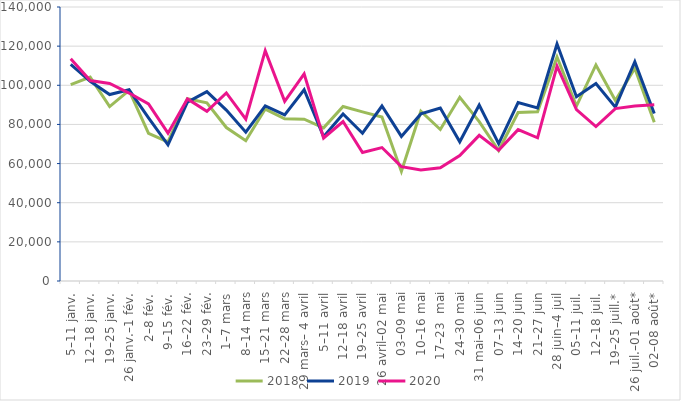
| Category | 2018 | 2019 | 2020 |
|---|---|---|---|
| 5–11 janv. | 100330 | 110701 | 113506 |
| 12–18 janv. | 104190 | 102045 | 102407 |
| 19–25 janv. | 89142 | 95260 | 100966 |
| 26 janv.–1 fév. | 97441 | 97699 | 96042 |
| 2–8 fév. | 75434 | 83347 | 90495 |
| 9–15 fév. | 71031 | 69559 | 75523 |
| 16–22 fév. | 93102 | 91428 | 93003 |
| 23–29 fév. | 91065 | 96774 | 86699 |
| 1–7 mars | 78415 | 87314 | 96119 |
| 8–14 mars | 71697 | 76021 | 82690 |
| 15–21 mars | 87845 | 89536 | 117673 |
| 22–28 mars | 82895 | 84912 | 91763.636 |
| 29 mars– 4 avril | 82654 | 97699 | 105802 |
| 5–11 avril | 78244 | 73699 | 73060.606 |
| 12–18 avril | 89129 | 85348 | 81477 |
| 19–25 avril | 86398 | 75509 | 65653 |
| 26 avril–02 mai | 83743 | 89413 | 68188 |
| 03–09 mai | 56008 | 73891 | 58423 |
| 10–16 mai | 86722 | 85364 | 56762 |
| 17–23  mai | 77423 | 88345 | 57817 |
| 24–30 mai | 93888 | 71115 | 64117 |
| 31 mai–06 juin | 81416 | 89880 | 74412 |
| 07–13 juin | 66658 | 70150 | 66851 |
| 14–20 juin | 86057 | 91157 | 77340 |
| 21–27 juin | 86474 | 88454 | 73165 |
| 28 juin–4 juil | 114502 | 121118 | 109774 |
| 05–11 juil. | 89389 | 94137 | 87596 |
| 12–18 juil. | 110384 | 100940 | 78915 |
| 19–25 juill.* | 92231 | 88807 | 88097 |
| 26 juil.–01 août* | 108699 | 112047 | 89370 |
| 02–08 août* | 81067 | 85538 | 90012 |